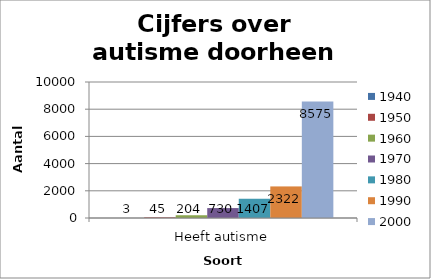
| Category | 1940 | 1950 | 1960 | 1970 | 1980 | 1990 | 2000 |
|---|---|---|---|---|---|---|---|
| Heeft autisme | 3 | 45 | 204 | 730 | 1407 | 2322 | 8575 |